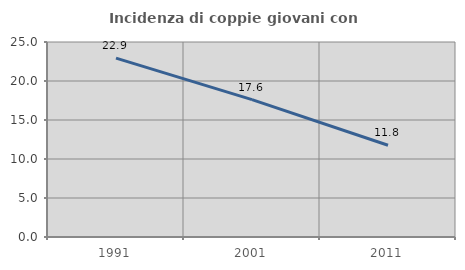
| Category | Incidenza di coppie giovani con figli |
|---|---|
| 1991.0 | 22.928 |
| 2001.0 | 17.62 |
| 2011.0 | 11.767 |